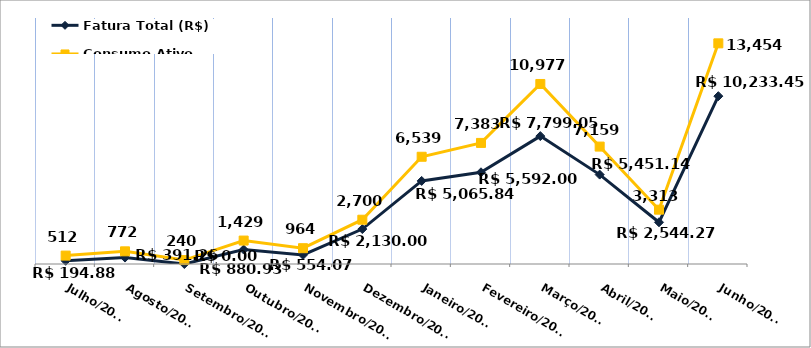
| Category | Fatura Total (R$) |
|---|---|
| Julho/2023 | 194.88 |
| Agosto/2023 | 391.26 |
| Setembro/2023 | 0 |
| Outubro/2023 | 880.93 |
| Novembro/2023 | 554.07 |
| Dezembro/2023 | 2130 |
| Janeiro/2024 | 5065.84 |
| Fevereiro/2024 | 5592 |
| Março/2024 | 7799.05 |
| Abril/2024 | 5451.14 |
| Maio/2024 | 2544.27 |
| Junho/2024 | 10233.45 |